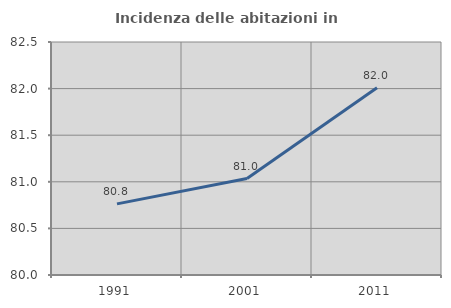
| Category | Incidenza delle abitazioni in proprietà  |
|---|---|
| 1991.0 | 80.763 |
| 2001.0 | 81.034 |
| 2011.0 | 82.01 |